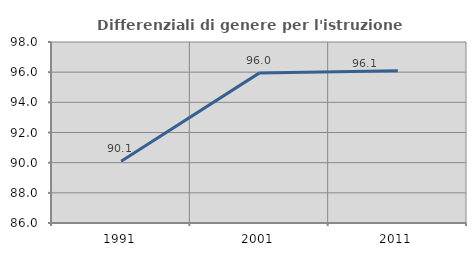
| Category | Differenziali di genere per l'istruzione superiore |
|---|---|
| 1991.0 | 90.088 |
| 2001.0 | 95.953 |
| 2011.0 | 96.096 |